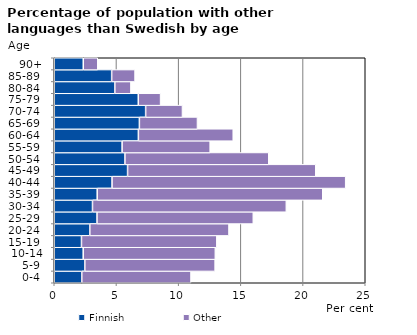
| Category | Finnish | Other |
|---|---|---|
|   0-4  | 2.213 | 8.779 |
|   5-9  | 2.458 | 10.474 |
| 10-14 | 2.328 | 10.619 |
| 15-19  | 2.188 | 10.881 |
| 20-24  | 2.86 | 11.186 |
| 25-29  | 3.439 | 12.561 |
| 30-34  | 3.075 | 15.581 |
| 35-39  | 3.454 | 18.131 |
| 40-44  | 4.645 | 18.781 |
| 45-49  | 5.895 | 15.128 |
| 50-54  | 5.681 | 11.564 |
| 55-59  | 5.455 | 7.078 |
| 60-64  | 6.762 | 7.626 |
| 65-69  | 6.844 | 4.668 |
| 70-74  | 7.347 | 2.96 |
| 75-79  | 6.754 | 1.793 |
| 80-84  | 4.871 | 1.292 |
| 85-89  | 4.615 | 1.88 |
| 90+ | 2.332 | 1.166 |